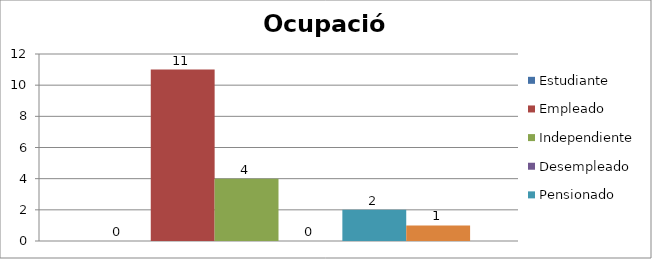
| Category | Estudiante | Empleado | Independiente | Desempleado  | Pensionado | Ama de casa |
|---|---|---|---|---|---|---|
| 0 | 0 | 11 | 4 | 0 | 2 | 1 |